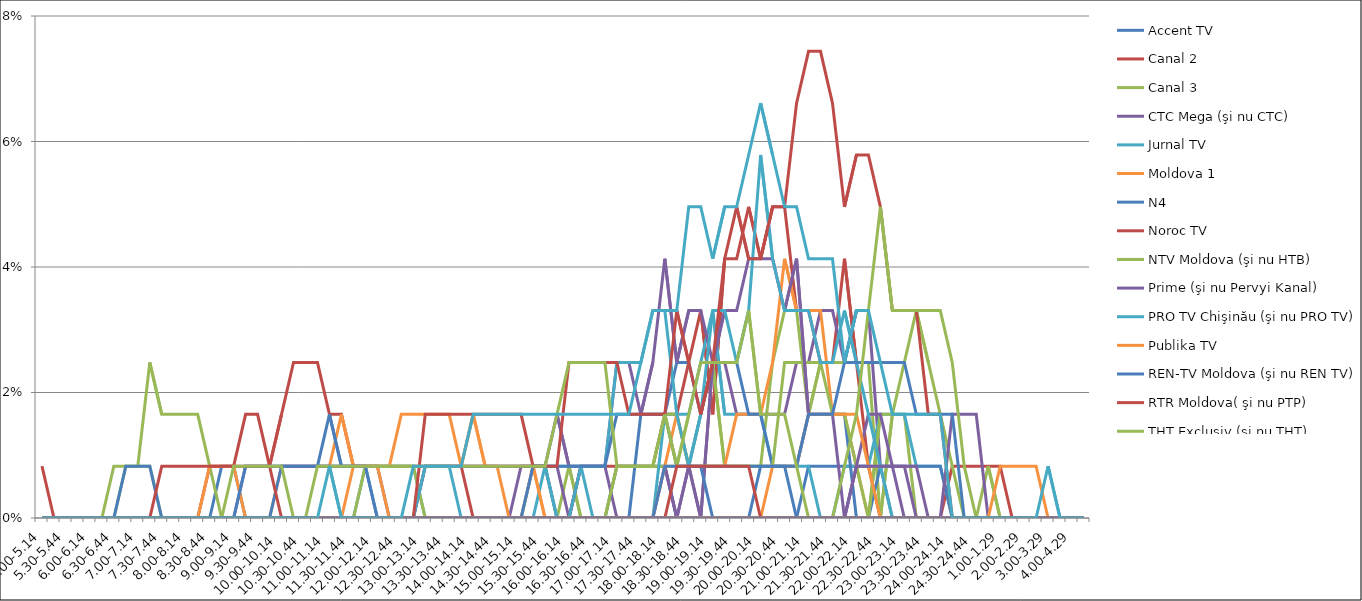
| Category | Accent TV | Canal 2 | Canal 3 | CTC Mega (şi nu CTC) | Jurnal TV | Moldova 1 | N4 | Noroc TV | NTV Moldova (şi nu HTB) | Prime (şi nu Pervyi Kanal) | PRO TV Chişinău (şi nu PRO TV) | Publika TV  | REN-TV Moldova (şi nu REN TV)  | RTR Moldova( şi nu PTP)  | THT Exclusiv (şi nu THT) | TV8 | TVC 21 | TVR MOLDOVA (şi nu TVR) | Canal Regional | Familia Domashniy | ITV | Moldova 2 | Alt canal |
|---|---|---|---|---|---|---|---|---|---|---|---|---|---|---|---|---|---|---|---|---|---|---|---|
| 5.00-5.14 | 0 | 0 | 0 | 0 | 0 | 0 | 0 | 0 | 0 | 0 | 0 | 0 | 0 | 0.008 | 0 | 0 | 0 | 0 | 0 | 0 | 0 | 0 | 0 |
| 5.15-5.29 | 0 | 0 | 0 | 0 | 0 | 0 | 0 | 0 | 0 | 0 | 0 | 0 | 0 | 0 | 0 | 0 | 0 | 0 | 0 | 0 | 0 | 0 | 0 |
| 5.30-5.44 | 0 | 0 | 0 | 0 | 0 | 0 | 0 | 0 | 0 | 0 | 0 | 0 | 0 | 0 | 0 | 0 | 0 | 0 | 0 | 0 | 0 | 0 | 0 |
| 5.45-5.59 | 0 | 0 | 0 | 0 | 0 | 0 | 0 | 0 | 0 | 0 | 0 | 0 | 0 | 0 | 0 | 0 | 0 | 0 | 0 | 0 | 0 | 0 | 0 |
| 6.00-6.14 | 0 | 0 | 0 | 0 | 0 | 0 | 0 | 0 | 0 | 0 | 0 | 0 | 0 | 0 | 0 | 0 | 0 | 0 | 0 | 0 | 0 | 0 | 0 |
| 6.15-6.29 | 0 | 0 | 0 | 0 | 0 | 0 | 0 | 0 | 0 | 0 | 0 | 0 | 0 | 0 | 0 | 0 | 0 | 0 | 0 | 0 | 0 | 0 | 0 |
| 6.30-6.44 | 0 | 0 | 0 | 0 | 0 | 0 | 0 | 0 | 0.008 | 0 | 0 | 0 | 0 | 0 | 0 | 0 | 0 | 0 | 0 | 0 | 0 | 0 | 0 |
| 6.45-6.59 | 0 | 0 | 0.008 | 0 | 0 | 0 | 0 | 0 | 0.008 | 0 | 0 | 0 | 0.008 | 0 | 0 | 0 | 0 | 0 | 0 | 0 | 0 | 0 | 0 |
| 7.00-7.14 | 0 | 0 | 0.008 | 0 | 0 | 0 | 0 | 0 | 0.008 | 0 | 0 | 0 | 0.008 | 0 | 0 | 0 | 0 | 0 | 0 | 0 | 0 | 0 | 0 |
| 7.15-7.29 | 0 | 0 | 0.008 | 0 | 0 | 0 | 0 | 0 | 0.025 | 0 | 0 | 0 | 0.008 | 0 | 0 | 0 | 0 | 0 | 0 | 0 | 0 | 0 | 0 |
| 7.30-7.44 | 0 | 0 | 0 | 0 | 0 | 0 | 0 | 0 | 0.017 | 0 | 0 | 0 | 0 | 0.008 | 0 | 0 | 0 | 0 | 0 | 0 | 0 | 0 | 0 |
| 7.45-7.59 | 0 | 0 | 0 | 0 | 0 | 0 | 0 | 0 | 0.017 | 0 | 0 | 0 | 0 | 0.008 | 0 | 0 | 0 | 0 | 0 | 0 | 0 | 0 | 0 |
| 8.00-8.14 | 0 | 0 | 0 | 0 | 0 | 0 | 0 | 0 | 0.017 | 0 | 0 | 0 | 0 | 0.008 | 0 | 0 | 0 | 0 | 0 | 0 | 0 | 0 | 0 |
| 8.15-8.29 | 0 | 0 | 0 | 0 | 0 | 0 | 0 | 0 | 0.017 | 0 | 0 | 0 | 0 | 0.008 | 0 | 0 | 0 | 0 | 0 | 0 | 0 | 0 | 0 |
| 8.30-8.44 | 0 | 0.008 | 0 | 0 | 0 | 0 | 0 | 0 | 0.008 | 0 | 0 | 0.008 | 0 | 0.008 | 0 | 0 | 0 | 0 | 0 | 0 | 0 | 0 | 0 |
| 8.45-8.59 | 0.008 | 0.008 | 0 | 0 | 0 | 0 | 0 | 0 | 0 | 0 | 0 | 0.008 | 0 | 0.008 | 0 | 0 | 0 | 0 | 0 | 0 | 0 | 0 | 0 |
| 9.00-9.14 | 0.008 | 0.008 | 0 | 0 | 0 | 0 | 0 | 0 | 0 | 0 | 0 | 0.008 | 0 | 0.008 | 0.008 | 0 | 0 | 0 | 0 | 0 | 0 | 0 | 0 |
| 9.15-9.29 | 0 | 0.017 | 0 | 0 | 0 | 0 | 0 | 0 | 0 | 0.008 | 0 | 0 | 0.008 | 0.008 | 0.008 | 0 | 0 | 0 | 0 | 0 | 0 | 0 | 0 |
| 9.30-9.44 | 0 | 0.017 | 0 | 0 | 0 | 0 | 0 | 0 | 0 | 0.008 | 0 | 0 | 0.008 | 0.008 | 0.008 | 0 | 0 | 0 | 0 | 0 | 0 | 0 | 0 |
| 9.45-9.59 | 0 | 0.008 | 0 | 0 | 0 | 0 | 0 | 0 | 0 | 0.008 | 0 | 0 | 0.008 | 0.008 | 0.008 | 0 | 0 | 0 | 0 | 0 | 0 | 0 | 0 |
| 10.00-10.14 | 0 | 0.017 | 0 | 0 | 0 | 0.008 | 0.008 | 0 | 0 | 0.008 | 0 | 0 | 0.008 | 0 | 0.008 | 0 | 0 | 0 | 0 | 0 | 0 | 0 | 0 |
| 10.15-10.29 | 0 | 0.025 | 0 | 0 | 0 | 0.008 | 0.008 | 0 | 0 | 0.008 | 0 | 0 | 0.008 | 0 | 0 | 0 | 0 | 0 | 0 | 0 | 0 | 0 | 0 |
| 10.30-10.44 | 0 | 0.025 | 0 | 0 | 0 | 0.008 | 0.008 | 0 | 0 | 0.008 | 0 | 0 | 0.008 | 0 | 0 | 0 | 0 | 0 | 0 | 0 | 0 | 0 | 0 |
| 10.45-10.59 | 0 | 0.025 | 0 | 0 | 0 | 0.008 | 0.008 | 0 | 0 | 0.008 | 0 | 0 | 0.008 | 0 | 0.008 | 0 | 0 | 0 | 0 | 0 | 0 | 0 | 0 |
| 11.00-11.14 | 0 | 0.017 | 0 | 0 | 0 | 0.008 | 0.008 | 0 | 0 | 0.008 | 0 | 0 | 0.017 | 0 | 0.008 | 0 | 0 | 0 | 0 | 0 | 0 | 0 | 0.008 |
| 11.15-11.29 | 0 | 0.017 | 0 | 0 | 0 | 0.017 | 0.008 | 0 | 0 | 0.008 | 0 | 0 | 0.008 | 0 | 0.008 | 0 | 0 | 0 | 0 | 0 | 0 | 0 | 0 |
| 11.30-11.44 | 0 | 0.008 | 0 | 0 | 0 | 0.008 | 0.008 | 0 | 0 | 0.008 | 0 | 0.008 | 0.008 | 0 | 0.008 | 0 | 0 | 0 | 0 | 0 | 0 | 0 | 0 |
| 11.45-11.59 | 0 | 0.008 | 0 | 0 | 0.008 | 0.008 | 0.008 | 0 | 0.008 | 0.008 | 0 | 0.008 | 0.008 | 0 | 0.008 | 0 | 0 | 0 | 0 | 0 | 0 | 0 | 0 |
| 12.00-12.14 | 0 | 0.008 | 0 | 0 | 0.008 | 0.008 | 0 | 0 | 0.008 | 0.008 | 0 | 0.008 | 0 | 0 | 0.008 | 0 | 0 | 0 | 0 | 0 | 0 | 0 | 0 |
| 12.15-12.29 | 0 | 0.008 | 0 | 0 | 0.008 | 0.008 | 0 | 0 | 0.008 | 0 | 0 | 0 | 0 | 0 | 0.008 | 0 | 0 | 0 | 0 | 0 | 0 | 0 | 0 |
| 12.30-12.44 | 0 | 0.008 | 0 | 0 | 0.008 | 0.017 | 0 | 0 | 0.008 | 0 | 0 | 0 | 0 | 0 | 0.008 | 0 | 0 | 0 | 0 | 0 | 0 | 0 | 0 |
| 12.45-12.59 | 0 | 0.008 | 0 | 0 | 0.008 | 0.017 | 0 | 0 | 0.008 | 0 | 0 | 0 | 0 | 0 | 0.008 | 0 | 0 | 0 | 0 | 0 | 0 | 0 | 0.008 |
| 13.00-13.14 | 0 | 0.008 | 0 | 0 | 0 | 0.017 | 0 | 0.008 | 0 | 0.008 | 0.008 | 0 | 0 | 0.017 | 0.008 | 0 | 0 | 0 | 0 | 0 | 0 | 0 | 0.008 |
| 13.15-13.29 | 0 | 0.008 | 0 | 0 | 0 | 0.017 | 0 | 0.008 | 0 | 0.008 | 0.008 | 0 | 0 | 0.017 | 0.008 | 0 | 0 | 0 | 0 | 0 | 0 | 0 | 0.008 |
| 13.30-13.44 | 0 | 0.008 | 0 | 0 | 0 | 0.017 | 0 | 0.008 | 0 | 0.008 | 0.008 | 0 | 0 | 0.017 | 0.008 | 0 | 0 | 0 | 0 | 0 | 0 | 0 | 0.008 |
| 13.45-13.59 | 0 | 0.008 | 0 | 0 | 0 | 0.008 | 0 | 0.008 | 0 | 0.008 | 0 | 0 | 0 | 0.017 | 0.008 | 0 | 0 | 0 | 0 | 0 | 0 | 0 | 0.008 |
| 14.00-14.14 | 0 | 0.008 | 0 | 0 | 0 | 0.017 | 0 | 0 | 0 | 0.008 | 0 | 0 | 0 | 0.017 | 0.008 | 0 | 0 | 0 | 0 | 0 | 0 | 0 | 0.017 |
| 14.15-14.29 | 0 | 0.008 | 0 | 0 | 0 | 0.008 | 0 | 0 | 0 | 0.008 | 0 | 0 | 0 | 0.017 | 0.008 | 0 | 0 | 0 | 0 | 0 | 0 | 0 | 0.017 |
| 14.30-14.44 | 0 | 0.008 | 0 | 0 | 0 | 0.008 | 0 | 0 | 0 | 0.008 | 0 | 0 | 0 | 0.017 | 0.008 | 0 | 0 | 0 | 0 | 0 | 0 | 0 | 0.017 |
| 14.45-14.59 | 0 | 0.008 | 0 | 0 | 0 | 0 | 0 | 0 | 0 | 0.008 | 0 | 0 | 0 | 0.017 | 0.008 | 0 | 0 | 0 | 0 | 0 | 0 | 0 | 0.017 |
| 15.00-15.14 | 0 | 0.008 | 0 | 0.008 | 0 | 0 | 0 | 0 | 0 | 0.008 | 0 | 0 | 0 | 0.017 | 0.008 | 0 | 0 | 0 | 0 | 0 | 0 | 0 | 0.017 |
| 15.15-15.29 | 0 | 0.008 | 0 | 0.008 | 0.008 | 0 | 0 | 0 | 0 | 0.008 | 0 | 0.008 | 0.008 | 0.008 | 0.008 | 0 | 0 | 0 | 0 | 0 | 0 | 0 | 0.017 |
| 15.30-15.44 | 0 | 0.008 | 0 | 0.008 | 0.008 | 0 | 0 | 0 | 0 | 0.008 | 0.008 | 0 | 0.008 | 0.008 | 0.008 | 0 | 0 | 0 | 0 | 0 | 0 | 0 | 0.017 |
| 15.45-15.59 | 0 | 0 | 0 | 0.008 | 0.008 | 0 | 0 | 0 | 0 | 0.017 | 0 | 0 | 0.008 | 0.008 | 0.017 | 0 | 0 | 0 | 0 | 0 | 0 | 0 | 0.017 |
| 16.00-16.14 | 0 | 0 | 0.008 | 0 | 0.008 | 0 | 0 | 0 | 0 | 0.008 | 0 | 0 | 0.008 | 0.025 | 0.025 | 0 | 0 | 0 | 0 | 0 | 0 | 0 | 0.017 |
| 16.15-16.29 | 0 | 0.008 | 0 | 0.008 | 0.008 | 0 | 0 | 0 | 0 | 0.008 | 0.008 | 0 | 0.008 | 0.025 | 0.025 | 0 | 0 | 0 | 0 | 0 | 0 | 0 | 0.017 |
| 16.30-16.44 | 0 | 0.008 | 0 | 0.008 | 0 | 0 | 0 | 0 | 0 | 0.008 | 0.008 | 0 | 0.008 | 0.025 | 0.025 | 0 | 0 | 0 | 0 | 0 | 0 | 0 | 0.017 |
| 16.45-16.59 | 0 | 0.008 | 0 | 0.008 | 0 | 0 | 0 | 0 | 0 | 0.008 | 0.008 | 0 | 0.008 | 0.025 | 0.025 | 0 | 0 | 0 | 0 | 0 | 0 | 0 | 0.017 |
| 17.00-17.14 | 0.008 | 0.008 | 0.008 | 0 | 0 | 0 | 0 | 0 | 0.008 | 0.025 | 0.025 | 0 | 0.017 | 0.025 | 0.008 | 0 | 0 | 0 | 0 | 0 | 0 | 0 | 0.017 |
| 17.15-17.29 | 0.008 | 0.008 | 0.008 | 0 | 0 | 0 | 0 | 0 | 0.008 | 0.025 | 0.025 | 0 | 0.017 | 0.017 | 0.008 | 0 | 0 | 0 | 0 | 0 | 0 | 0 | 0.017 |
| 17.30-17.44 | 0.008 | 0.008 | 0.008 | 0 | 0 | 0 | 0.017 | 0 | 0.008 | 0.017 | 0.025 | 0 | 0.017 | 0.017 | 0.008 | 0 | 0 | 0 | 0 | 0 | 0 | 0 | 0.025 |
| 17.45-17.59 | 0.008 | 0.008 | 0.008 | 0 | 0 | 0 | 0.017 | 0 | 0.008 | 0.025 | 0.033 | 0 | 0.017 | 0.017 | 0.008 | 0 | 0 | 0 | 0 | 0 | 0 | 0 | 0.033 |
| 18.00-18.14 | 0.008 | 0.017 | 0.008 | 0.008 | 0.017 | 0.008 | 0.017 | 0 | 0.017 | 0.041 | 0.033 | 0 | 0.017 | 0.017 | 0.017 | 0 | 0 | 0 | 0.008 | 0 | 0 | 0 | 0.033 |
| 18.15-18.29 | 0 | 0.017 | 0.008 | 0 | 0.017 | 0.017 | 0.025 | 0 | 0.017 | 0.025 | 0.017 | 0 | 0.008 | 0.033 | 0.008 | 0 | 0 | 0 | 0.008 | 0.008 | 0 | 0 | 0.033 |
| 18.30-18.44 | 0 | 0.025 | 0.008 | 0.008 | 0.017 | 0.008 | 0.025 | 0 | 0.008 | 0.033 | 0.008 | 0 | 0.008 | 0.025 | 0.017 | 0 | 0 | 0 | 0.008 | 0.008 | 0 | 0 | 0.05 |
| 18.45-18.59 | 0 | 0.033 | 0.017 | 0 | 0.025 | 0.008 | 0.017 | 0 | 0.008 | 0.033 | 0.017 | 0 | 0.008 | 0.017 | 0.025 | 0 | 0 | 0 | 0.008 | 0.008 | 0 | 0 | 0.05 |
| 19.00-19.14 | 0 | 0.017 | 0.025 | 0.025 | 0.033 | 0.008 | 0.025 | 0 | 0.008 | 0.025 | 0.033 | 0 | 0 | 0.025 | 0.025 | 0 | 0 | 0 | 0.008 | 0.008 | 0 | 0 | 0.041 |
| 19.15-19.29 | 0 | 0.041 | 0.008 | 0.025 | 0.017 | 0.008 | 0.025 | 0 | 0.008 | 0.033 | 0.033 | 0 | 0 | 0.041 | 0.025 | 0 | 0 | 0 | 0.008 | 0.008 | 0 | 0 | 0.05 |
| 19.30-19.44 | 0 | 0.041 | 0.008 | 0.017 | 0.017 | 0.017 | 0.025 | 0 | 0.008 | 0.033 | 0.025 | 0 | 0 | 0.05 | 0.025 | 0 | 0 | 0 | 0.008 | 0.008 | 0 | 0 | 0.05 |
| 19.45-19.59 | 0 | 0.05 | 0.008 | 0.017 | 0.017 | 0.017 | 0.017 | 0 | 0.008 | 0.041 | 0.033 | 0 | 0 | 0.041 | 0.033 | 0 | 0 | 0 | 0.008 | 0.008 | 0 | 0 | 0.058 |
| 20.00-20.14 | 0 | 0.041 | 0.008 | 0.017 | 0.017 | 0.017 | 0.017 | 0 | 0.008 | 0.041 | 0.058 | 0 | 0.008 | 0.041 | 0.017 | 0 | 0 | 0 | 0.008 | 0 | 0 | 0 | 0.066 |
| 20.15-20.29 | 0 | 0.05 | 0.025 | 0.017 | 0.008 | 0.025 | 0.008 | 0 | 0.008 | 0.041 | 0.041 | 0.008 | 0.008 | 0.05 | 0.017 | 0 | 0 | 0 | 0.008 | 0 | 0 | 0 | 0.058 |
| 20.30-20.44 | 0 | 0.05 | 0.033 | 0.017 | 0.008 | 0.041 | 0.008 | 0 | 0.025 | 0.033 | 0.033 | 0.008 | 0.008 | 0.05 | 0.017 | 0 | 0 | 0 | 0.008 | 0 | 0 | 0 | 0.05 |
| 20.45-20.59 | 0 | 0.033 | 0.033 | 0.025 | 0.008 | 0.033 | 0.008 | 0 | 0.025 | 0.041 | 0.033 | 0.008 | 0.008 | 0.066 | 0.008 | 0 | 0 | 0 | 0 | 0 | 0 | 0 | 0.05 |
| 21.00-21.14 | 0.008 | 0.033 | 0.017 | 0.025 | 0.008 | 0.033 | 0.017 | 0 | 0.025 | 0.017 | 0.033 | 0.017 | 0.017 | 0.074 | 0 | 0 | 0 | 0 | 0 | 0 | 0 | 0 | 0.041 |
| 21.15-21.29 | 0.008 | 0.025 | 0.025 | 0.033 | 0 | 0.033 | 0.017 | 0 | 0.025 | 0.017 | 0.025 | 0.017 | 0.017 | 0.074 | 0 | 0 | 0 | 0 | 0 | 0 | 0 | 0 | 0.041 |
| 21.30-21.44 | 0.008 | 0.025 | 0.025 | 0.033 | 0 | 0.017 | 0.017 | 0 | 0.017 | 0.017 | 0.025 | 0.017 | 0.017 | 0.066 | 0 | 0 | 0 | 0 | 0 | 0 | 0 | 0 | 0.041 |
| 21.45-21.59 | 0.008 | 0.041 | 0.025 | 0.025 | 0.008 | 0.017 | 0.017 | 0 | 0.017 | 0 | 0.033 | 0.017 | 0.025 | 0.05 | 0.008 | 0 | 0 | 0 | 0 | 0 | 0 | 0 | 0.025 |
| 22.00-22.14 | 0.008 | 0.025 | 0.025 | 0.033 | 0.008 | 0.008 | 0 | 0 | 0.008 | 0.008 | 0.025 | 0.017 | 0.025 | 0.058 | 0.017 | 0.008 | 0 | 0 | 0 | 0 | 0 | 0 | 0.033 |
| 22.15-22.29 | 0.008 | 0.008 | 0.025 | 0.033 | 0.008 | 0 | 0 | 0 | 0 | 0.017 | 0.017 | 0.008 | 0.025 | 0.058 | 0.033 | 0.008 | 0 | 0 | 0 | 0 | 0 | 0 | 0.033 |
| 22.30-22.44 | 0.008 | 0 | 0 | 0.008 | 0.017 | 0 | 0.008 | 0 | 0.017 | 0.017 | 0.008 | 0 | 0.025 | 0.05 | 0.05 | 0.008 | 0 | 0 | 0 | 0 | 0 | 0 | 0.025 |
| 22.45-22.59 | 0 | 0 | 0.017 | 0.008 | 0.017 | 0 | 0.008 | 0 | 0.017 | 0.008 | 0 | 0 | 0.025 | 0.033 | 0.033 | 0.008 | 0 | 0 | 0 | 0 | 0 | 0 | 0.017 |
| 23.00-23.14 | 0 | 0 | 0.017 | 0 | 0.017 | 0 | 0.008 | 0 | 0.025 | 0.008 | 0 | 0 | 0.025 | 0.033 | 0.033 | 0.008 | 0 | 0 | 0 | 0 | 0 | 0 | 0.017 |
| 23.15-23.29 | 0 | 0 | 0 | 0 | 0.008 | 0 | 0.008 | 0 | 0.033 | 0.008 | 0 | 0 | 0.017 | 0.033 | 0.033 | 0 | 0 | 0 | 0 | 0 | 0 | 0 | 0.017 |
| 23.30-23.44 | 0 | 0 | 0 | 0 | 0.008 | 0 | 0.008 | 0 | 0.025 | 0 | 0 | 0 | 0.017 | 0.017 | 0.033 | 0 | 0 | 0 | 0 | 0 | 0 | 0 | 0.017 |
| 23.45-23.59 | 0 | 0 | 0 | 0 | 0.008 | 0 | 0.008 | 0 | 0.017 | 0 | 0 | 0 | 0.017 | 0.017 | 0.033 | 0 | 0 | 0 | 0 | 0 | 0 | 0 | 0.017 |
| 24.00-24.14 | 0 | 0.008 | 0 | 0 | 0 | 0 | 0 | 0 | 0.008 | 0.017 | 0 | 0 | 0.017 | 0 | 0.025 | 0 | 0 | 0 | 0 | 0 | 0 | 0 | 0 |
| 24.15-24.29 | 0 | 0.008 | 0 | 0 | 0 | 0 | 0 | 0 | 0 | 0.017 | 0 | 0 | 0 | 0 | 0.008 | 0 | 0 | 0 | 0 | 0 | 0 | 0 | 0 |
| 24.30-24.44 | 0 | 0.008 | 0 | 0 | 0 | 0 | 0 | 0 | 0 | 0.017 | 0 | 0 | 0 | 0 | 0 | 0 | 0 | 0 | 0 | 0 | 0 | 0 | 0 |
| 24.45-24.59 | 0 | 0.008 | 0.008 | 0 | 0 | 0 | 0 | 0 | 0 | 0 | 0 | 0 | 0 | 0 | 0 | 0 | 0 | 0 | 0 | 0 | 0 | 0 | 0 |
| 1.00-1.29 | 0 | 0.008 | 0 | 0 | 0 | 0 | 0 | 0 | 0 | 0 | 0 | 0.008 | 0 | 0 | 0 | 0 | 0 | 0 | 0 | 0 | 0 | 0 | 0 |
| 1.30-1. 59 | 0 | 0 | 0 | 0 | 0 | 0 | 0 | 0 | 0 | 0 | 0 | 0.008 | 0 | 0 | 0 | 0 | 0 | 0 | 0 | 0 | 0 | 0 | 0 |
| 2.00-2.29 | 0 | 0 | 0 | 0 | 0 | 0 | 0 | 0 | 0 | 0 | 0 | 0.008 | 0 | 0 | 0 | 0 | 0 | 0 | 0 | 0 | 0 | 0 | 0 |
| 2.30-2.59 | 0 | 0 | 0 | 0 | 0 | 0 | 0 | 0 | 0 | 0 | 0 | 0.008 | 0 | 0 | 0 | 0 | 0 | 0 | 0 | 0 | 0 | 0 | 0 |
| 3.00-3.29 | 0 | 0 | 0 | 0 | 0 | 0 | 0 | 0 | 0 | 0 | 0 | 0 | 0 | 0 | 0 | 0 | 0 | 0 | 0 | 0 | 0 | 0 | 0.008 |
| 3.30-3.59 | 0 | 0 | 0 | 0 | 0 | 0 | 0 | 0 | 0 | 0 | 0 | 0 | 0 | 0 | 0 | 0 | 0 | 0 | 0 | 0 | 0 | 0 | 0 |
| 4.00-4.29 | 0 | 0 | 0 | 0 | 0 | 0 | 0 | 0 | 0 | 0 | 0 | 0 | 0 | 0 | 0 | 0 | 0 | 0 | 0 | 0 | 0 | 0 | 0 |
| 4.30-4.59 | 0 | 0 | 0 | 0 | 0 | 0 | 0 | 0 | 0 | 0 | 0 | 0 | 0 | 0 | 0 | 0 | 0 | 0 | 0 | 0 | 0 | 0 | 0 |